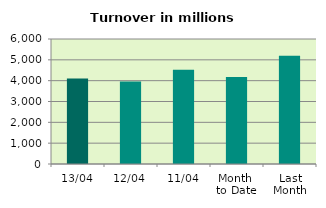
| Category | Series 0 |
|---|---|
| 13/04 | 4104.813 |
| 12/04 | 3958.415 |
| 11/04 | 4523.005 |
| Month 
to Date | 4173.652 |
| Last
Month | 5192.573 |